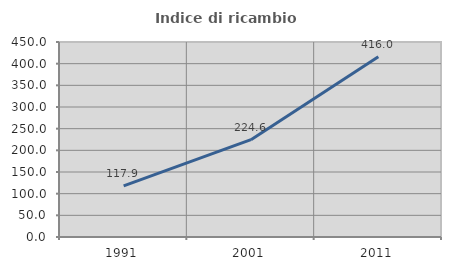
| Category | Indice di ricambio occupazionale  |
|---|---|
| 1991.0 | 117.895 |
| 2001.0 | 224.615 |
| 2011.0 | 416 |